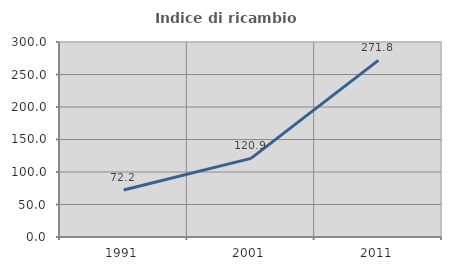
| Category | Indice di ricambio occupazionale  |
|---|---|
| 1991.0 | 72.201 |
| 2001.0 | 120.896 |
| 2011.0 | 271.795 |